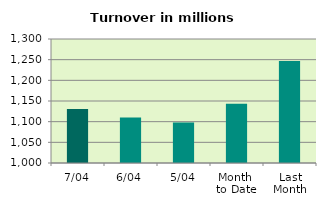
| Category | Series 0 |
|---|---|
| 7/04 | 1130.639 |
| 6/04 | 1109.994 |
| 5/04 | 1098.024 |
| Month 
to Date | 1143.617 |
| Last
Month | 1246.474 |